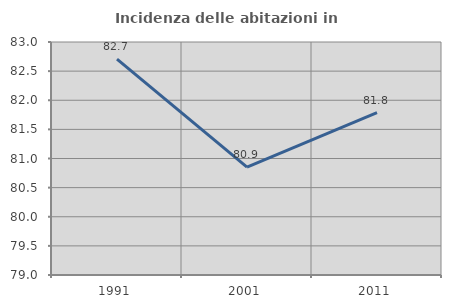
| Category | Incidenza delle abitazioni in proprietà  |
|---|---|
| 1991.0 | 82.707 |
| 2001.0 | 80.853 |
| 2011.0 | 81.786 |